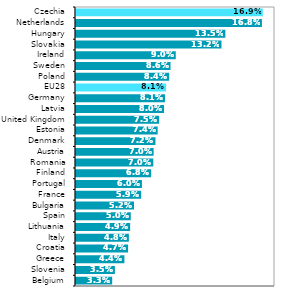
| Category | 2019 |
|---|---|
| Belgium | 0.033 |
| Slovenia | 0.035 |
| Greece | 0.044 |
| Croatia | 0.047 |
| Italy | 0.048 |
| Lithuania | 0.049 |
| Spain | 0.05 |
| Bulgaria | 0.052 |
| France | 0.059 |
| Portugal | 0.06 |
| Finland | 0.068 |
| Romania | 0.07 |
| Austria | 0.07 |
| Denmark | 0.072 |
| Estonia | 0.074 |
| United Kingdom | 0.075 |
| Latvia | 0.08 |
| Germany | 0.081 |
| EU28 | 0.081 |
| Poland | 0.084 |
| Sweden | 0.086 |
| Ireland | 0.09 |
| Slovakia | 0.132 |
| Hungary | 0.135 |
| Netherlands | 0.168 |
| Czechia | 0.169 |